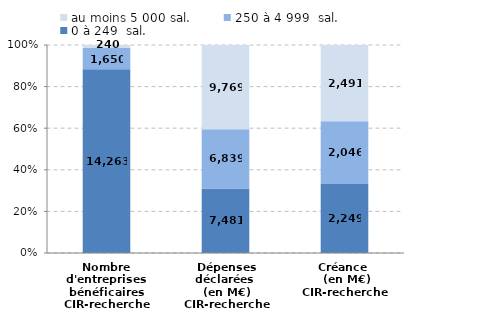
| Category | 0 à 249  sal. | 250 à 4 999  sal. | au moins 5 000 sal. |
|---|---|---|---|
| Nombre d'entreprises bénéficaires
CIR-recherche | 14263 | 1650 | 240 |
| Dépenses déclarées 
(en M€)
CIR-recherche | 7481.01 | 6838.62 | 9769.11 |
| Créance 
 (en M€)
CIR-recherche | 2248.62 | 2045.61 | 2491.1 |